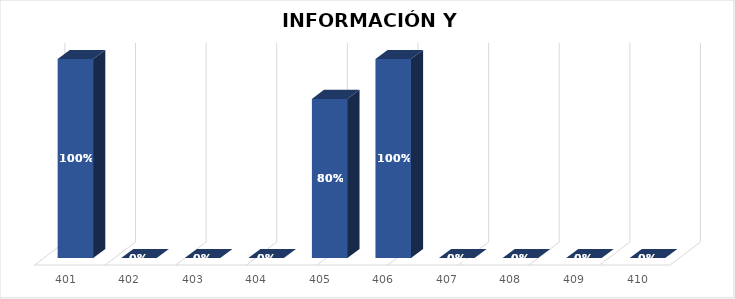
| Category | % Avance |
|---|---|
| 401.0 | 1 |
| 402.0 | 0 |
| 403.0 | 0 |
| 404.0 | 0 |
| 405.0 | 0.8 |
| 406.0 | 1 |
| 407.0 | 0 |
| 408.0 | 0 |
| 409.0 | 0 |
| 410.0 | 0 |